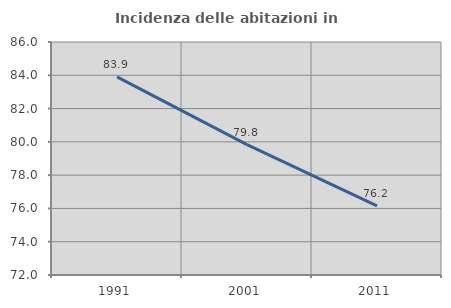
| Category | Incidenza delle abitazioni in proprietà  |
|---|---|
| 1991.0 | 83.904 |
| 2001.0 | 79.837 |
| 2011.0 | 76.159 |